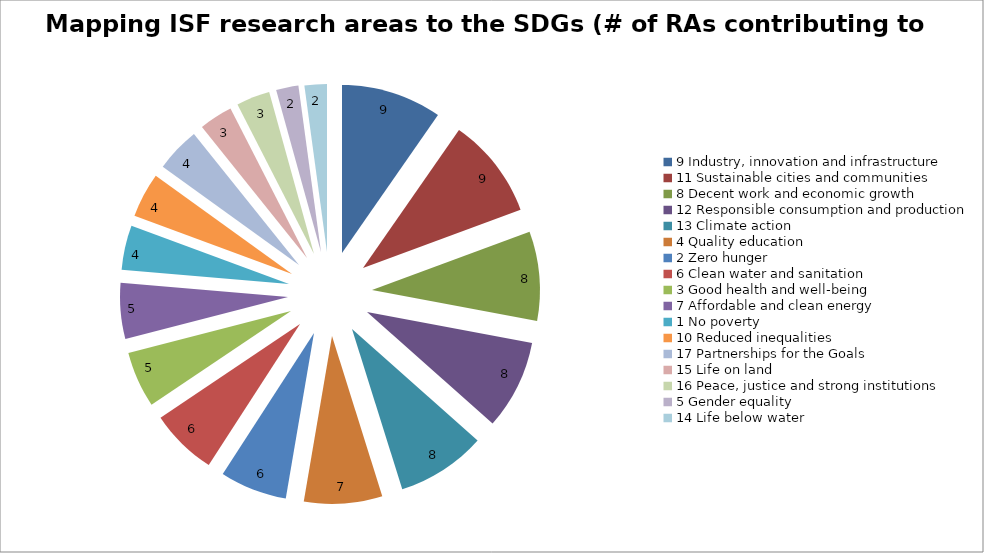
| Category | Series 0 |
|---|---|
| 9 Industry, innovation and infrastructure | 9 |
| 11 Sustainable cities and communities | 9 |
| 8 Decent work and economic growth | 8 |
| 12 Responsible consumption and production | 8 |
| 13 Climate action | 8 |
| 4 Quality education | 7 |
| 2 Zero hunger | 6 |
| 6 Clean water and sanitation | 6 |
| 3 Good health and well-being | 5 |
| 7 Affordable and clean energy | 5 |
| 1 No poverty | 4 |
| 10 Reduced inequalities | 4 |
| 17 Partnerships for the Goals | 4 |
| 15 Life on land | 3 |
| 16 Peace, justice and strong institutions | 3 |
| 5 Gender equality | 2 |
| 14 Life below water | 2 |